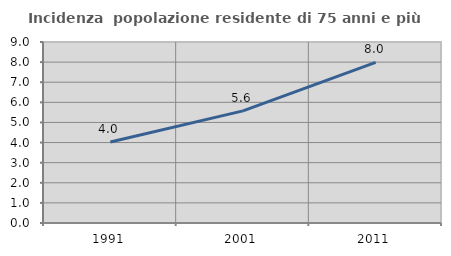
| Category | Incidenza  popolazione residente di 75 anni e più |
|---|---|
| 1991.0 | 4.023 |
| 2001.0 | 5.576 |
| 2011.0 | 7.984 |